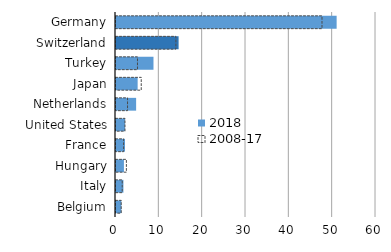
| Category | 2018 | 2008-17 |
|---|---|---|
| Germany | 50.917 | 47.538 |
| Switzerland | 14.448 | 13.819 |
| Turkey | 8.651 | 4.956 |
| Japan | 4.995 | 5.824 |
| Netherlands | 4.646 | 2.661 |
| United States | 2.089 | 2.069 |
| France | 2.073 | 1.755 |
| Hungary | 1.828 | 2.397 |
| Italy | 1.714 | 1.432 |
| Belgium | 1.229 | 1.201 |